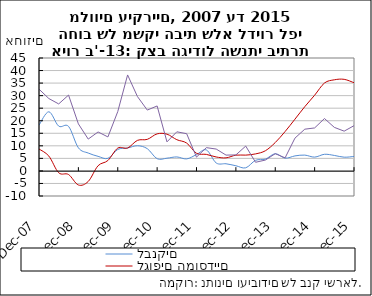
| Category | לבנקים | לגופים המוסדיים | לחברות כרטיסי אשראי |
|---|---|---|---|
| 2007-12-31 | 18.209 | 8.735 | 32.594 |
| 2008-03-31 | 23.566 | 5.913 | 28.835 |
| 2008-06-30 | 17.857 | -0.728 | 26.694 |
| 2008-09-30 | 17.74 | -1.435 | 30.223 |
| 2008-12-31 | 9.216 | -5.606 | 18.74 |
| 2009-03-31 | 7.115 | -4.204 | 12.684 |
| 2009-06-30 | 5.807 | 2.057 | 15.521 |
| 2009-09-30 | 4.997 | 4.155 | 13.543 |
| 2009-12-31 | 8.542 | 9.091 | 23.628 |
| 2010-03-31 | 9.135 | 9.135 | 38.249 |
| 2010-06-30 | 10.045 | 12.174 | 29.638 |
| 2010-09-30 | 8.865 | 12.575 | 24.249 |
| 2010-12-31 | 4.862 | 14.768 | 25.888 |
| 2011-03-31 | 5.068 | 14.644 | 11.572 |
| 2011-06-30 | 5.573 | 12.438 | 15.586 |
| 2011-09-30 | 4.787 | 11.097 | 14.83 |
| 2011-12-31 | 6.512 | 7.027 | 5.499 |
| 2012-03-31 | 8.367 | 6.578 | 9.27 |
| 2012-06-30 | 3.179 | 5.553 | 8.711 |
| 2012-09-30 | 2.845 | 5.204 | 6.298 |
| 2012-12-31 | 2.057 | 6.28 | 6.371 |
| 2013-03-31 | 1.23 | 6.294 | 9.89 |
| 2013-06-30 | 4.215 | 6.781 | 3.44 |
| 2013-09-30 | 4.701 | 8.04 | 4.327 |
| 2013-12-31 | 6.855 | 11.309 | 6.869 |
| 2014-03-31 | 5.09 | 15.693 | 5.211 |
| 2014-06-30 | 5.98 | 20.614 | 13.065 |
| 2014-09-30 | 6.3 | 25.606 | 16.629 |
| 2014-12-31 | 5.501 | 30.17 | 17.127 |
| 2015-03-31 | 6.624 | 35.032 | 20.874 |
| 2015-06-30 | 6.169 | 36.309 | 17.356 |
| 2015-09-30 | 5.47 | 36.5 | 15.844 |
| 2015-12-31 | 5.765 | 35.145 | 18.027 |